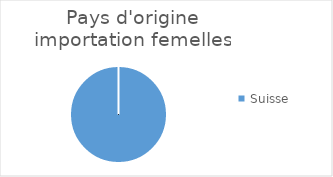
| Category | Series 0 |
|---|---|
| Suisse | 1 |